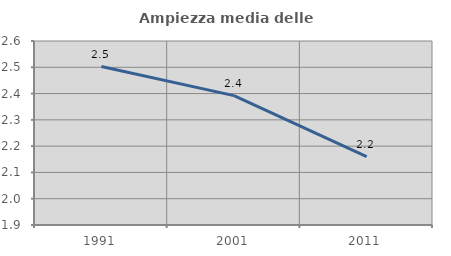
| Category | Ampiezza media delle famiglie |
|---|---|
| 1991.0 | 2.503 |
| 2001.0 | 2.392 |
| 2011.0 | 2.16 |